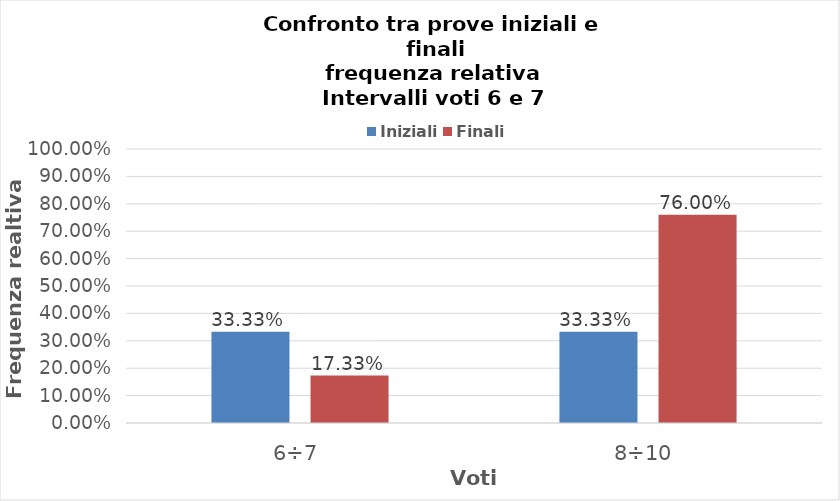
| Category | Iniziali | Finali |
|---|---|---|
| 6÷7 | 0.333 | 0.173 |
| 8÷10 | 0.333 | 0.76 |